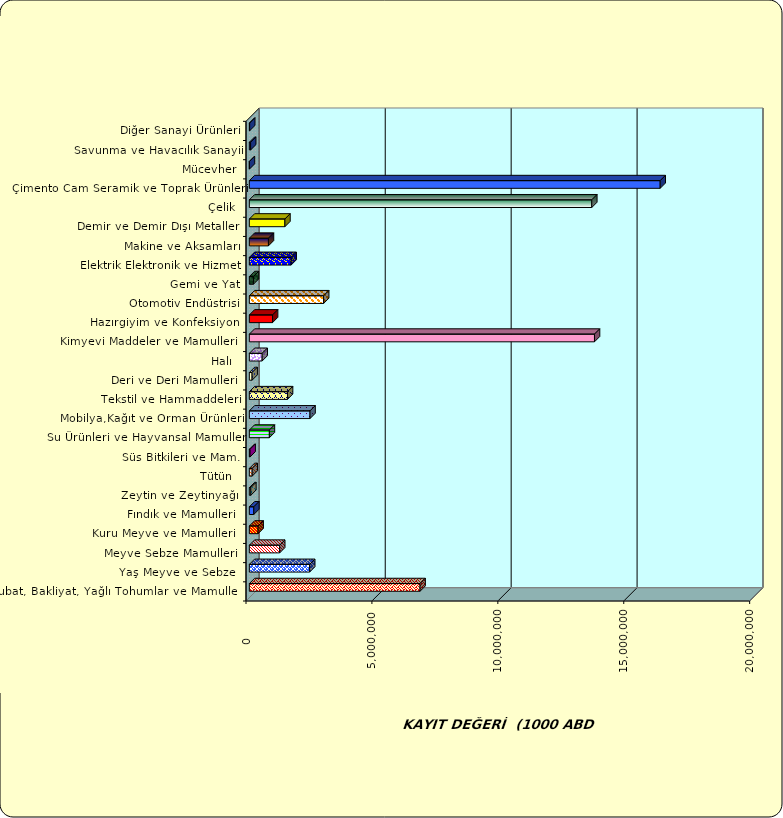
| Category | Series 0 |
|---|---|
|  Hububat, Bakliyat, Yağlı Tohumlar ve Mamulleri  | 6779197.815 |
|  Yaş Meyve ve Sebze   | 2395727.534 |
|  Meyve Sebze Mamulleri  | 1204647.237 |
|  Kuru Meyve ve Mamulleri   | 347178.883 |
|  Fındık ve Mamulleri  | 177331.626 |
|  Zeytin ve Zeytinyağı  | 58461.593 |
|  Tütün  | 112244.461 |
|  Süs Bitkileri ve Mam. | 29544.63 |
|  Su Ürünleri ve Hayvansal Mamuller | 795538.475 |
|  Mobilya,Kağıt ve Orman Ürünleri | 2408908.188 |
|  Tekstil ve Hammaddeleri | 1515394.666 |
|  Deri ve Deri Mamulleri  | 108853.115 |
|  Halı  | 509312.147 |
|  Kimyevi Maddeler ve Mamulleri   | 13705080.499 |
|  Hazırgiyim ve Konfeksiyon  | 921585.838 |
|  Otomotiv Endüstrisi | 2950313.396 |
|  Gemi ve Yat | 162425.207 |
|  Elektrik Elektronik ve Hizmet | 1659352.611 |
|  Makine ve Aksamları | 758346.475 |
|  Demir ve Demir Dışı Metaller  | 1412290.831 |
|  Çelik | 13597768.429 |
|  Çimento Cam Seramik ve Toprak Ürünleri | 16314156.536 |
|  Mücevher | 2275.34 |
|  Savunma ve Havacılık Sanayii | 51163.624 |
|  Diğer Sanayi Ürünleri | 13343.093 |